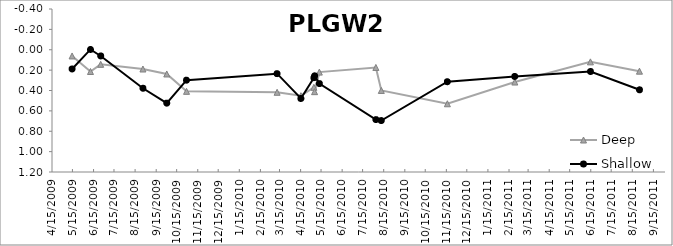
| Category | Deep | Shallow |
|---|---|---|
| 5/14/09 | 0.061 | 0.189 |
| 6/10/09 | 0.213 | -0.003 |
| 6/25/09 | 0.143 | 0.061 |
| 8/26/09 | 0.189 | 0.378 |
| 9/30/09 | 0.238 | 0.524 |
| 10/29/09 | 0.408 | 0.299 |
| 3/11/10 | 0.418 | 0.235 |
| 4/15/10 | 0.451 | 0.479 |
| 5/4/10 | 0.369 | 0.274 |
| 5/5/10 | 0.411 | 0.256 |
| 5/12/10 | 0.219 | 0.332 |
| 8/3/10 | 0.174 | 0.686 |
| 8/11/10 | 0.399 | 0.695 |
| 11/16/10 | 0.53 | 0.314 |
| 2/23/11 | 0.317 | 0.262 |
| 6/14/11 | 0.119 | 0.213 |
| 8/25/11 | 0.21 | 0.393 |